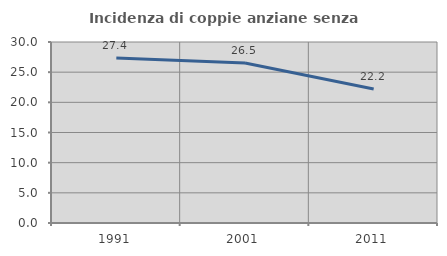
| Category | Incidenza di coppie anziane senza figli  |
|---|---|
| 1991.0 | 27.358 |
| 2001.0 | 26.506 |
| 2011.0 | 22.222 |